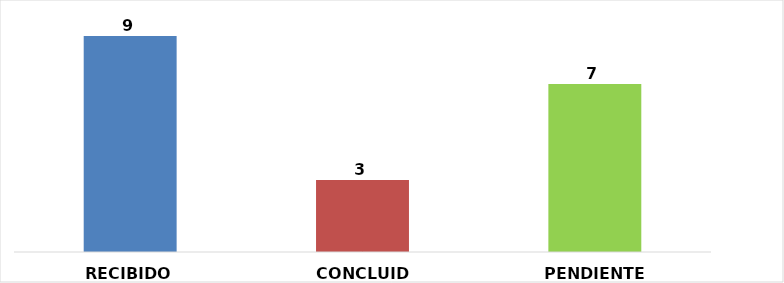
| Category | RECIBIDO |
|---|---|
| RECIBIDO | 9 |
| CONCLUIDO | 3 |
| PENDIENTE* | 7 |